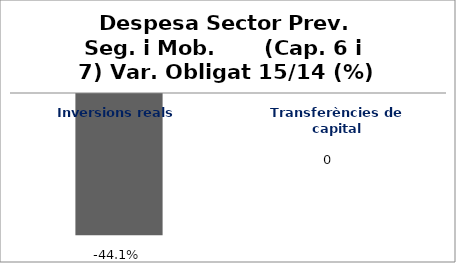
| Category | Series 0 |
|---|---|
| Inversions reals | -0.441 |
| Transferències de capital | 0 |